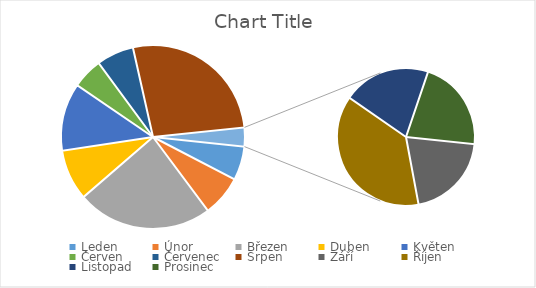
| Category | Series 0 |
|---|---|
| Leden | 1000 |
| Únor | 1200 |
| Březen | 4000 |
| Duben | 1500 |
| Květen | 2000 |
| Červen | 900 |
| Červenec | 1100 |
| Srpen | 4500 |
| Září | 114 |
| Říjen | 210 |
| Listopad | 115 |
| Prosinec | 120 |